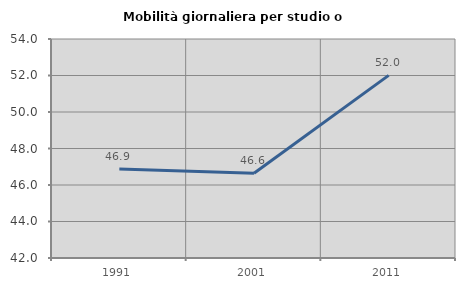
| Category | Mobilità giornaliera per studio o lavoro |
|---|---|
| 1991.0 | 46.877 |
| 2001.0 | 46.641 |
| 2011.0 | 52.007 |